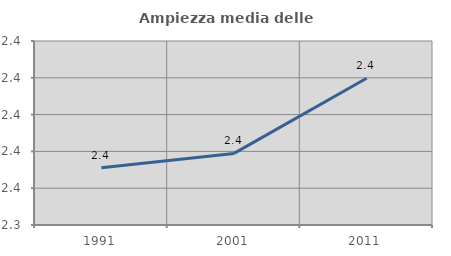
| Category | Ampiezza media delle famiglie |
|---|---|
| 1991.0 | 2.371 |
| 2001.0 | 2.379 |
| 2011.0 | 2.42 |